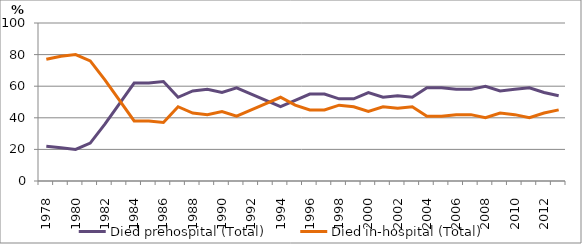
| Category | Died prehospital (Total) | Died in-hospital (Total) |
|---|---|---|
| 1978.0 | 22 | 77 |
| 1979.0 | 21 | 79 |
| 1980.0 | 20 | 80 |
| 1981.0 | 24 | 76 |
| 1982.0 | 36 | 64 |
| 1983.0 | 49 | 51 |
| 1984.0 | 62 | 38 |
| 1985.0 | 62 | 38 |
| 1986.0 | 63 | 37 |
| 1987.0 | 53 | 47 |
| 1988.0 | 57 | 43 |
| 1989.0 | 58 | 42 |
| 1990.0 | 56 | 44 |
| 1991.0 | 59 | 41 |
| 1992.0 | 55 | 45 |
| 1993.0 | 51 | 49 |
| 1994.0 | 47 | 53 |
| 1995.0 | 51 | 48 |
| 1996.0 | 55 | 45 |
| 1997.0 | 55 | 45 |
| 1998.0 | 52 | 48 |
| 1999.0 | 52 | 47 |
| 2000.0 | 56 | 44 |
| 2001.0 | 53 | 47 |
| 2002.0 | 54 | 46 |
| 2003.0 | 53 | 47 |
| 2004.0 | 59 | 41 |
| 2005.0 | 59 | 41 |
| 2006.0 | 58 | 42 |
| 2007.0 | 58 | 42 |
| 2008.0 | 60 | 40 |
| 2009.0 | 57 | 43 |
| 2010.0 | 58 | 42 |
| 2011.0 | 59 | 40 |
| 2012.0 | 56 | 43 |
| 2013.0 | 54 | 45 |